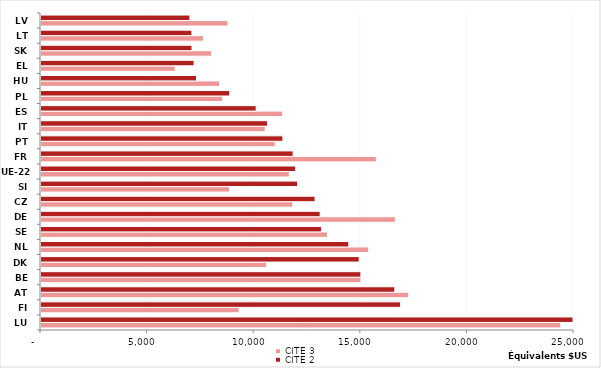
| Category | CITE 3 | CITE 2 |
|---|---|---|
| LU | 24380.79 | 25140.93 |
| FI | 9291.717 | 16868.69 |
| AT | 17248.25 | 16593.75 |
| BE | 15007.21 | 15005.33 |
| DK | 10584.33 | 14924.36 |
| NL | 15371.63 | 14437.63 |
| SE | 13437.07 | 13158.04 |
| DE | 16623.89 | 13095.69 |
| CZ | 11809.89 | 12855.98 |
| SI | 8852.577 | 12036.89 |
| UE-22 | 11646.267 | 11945.399 |
| FR | 15724.83 | 11825.47 |
| PT | 10990.83 | 11347.05 |
| IT | 10518.51 | 10623.15 |
| ES | 11334.19 | 10092.69 |
| PL | 8519.405 | 8856.016 |
| HU | 8373.018 | 7293.464 |
| EL | 6295.895 | 7179.343 |
| SK | 8003.166 | 7081.608 |
| LT | 7621.634 | 7078.816 |
| LV | 8769.723 | 6985.752 |